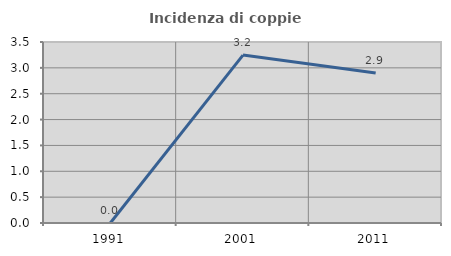
| Category | Incidenza di coppie miste |
|---|---|
| 1991.0 | 0 |
| 2001.0 | 3.247 |
| 2011.0 | 2.899 |